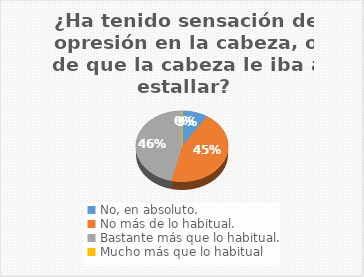
| Category | 6 |
|---|---|
| No, en absoluto. | 10 |
| No más de lo habitual. | 49 |
| Bastante más que lo habitual. | 51 |
| Mucho más que lo habitual | 0 |